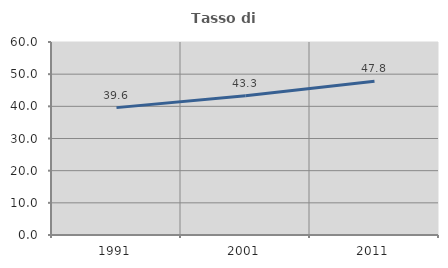
| Category | Tasso di occupazione   |
|---|---|
| 1991.0 | 39.6 |
| 2001.0 | 43.273 |
| 2011.0 | 47.766 |